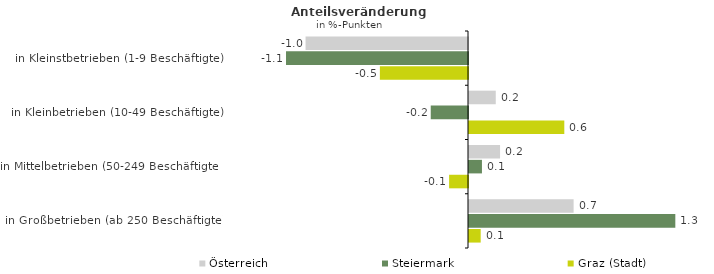
| Category | Österreich | Steiermark | Graz (Stadt) |
|---|---|---|---|
| in Kleinstbetrieben (1-9 Beschäftigte) | -1.011 | -1.133 | -0.548 |
| in Kleinbetrieben (10-49 Beschäftigte) | 0.167 | -0.232 | 0.593 |
| in Mittelbetrieben (50-249 Beschäftigte) | 0.193 | 0.081 | -0.118 |
| in Großbetrieben (ab 250 Beschäftigte) | 0.651 | 1.284 | 0.073 |